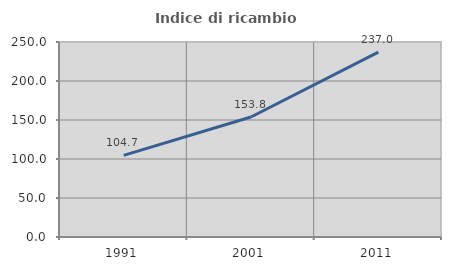
| Category | Indice di ricambio occupazionale  |
|---|---|
| 1991.0 | 104.651 |
| 2001.0 | 153.846 |
| 2011.0 | 236.957 |